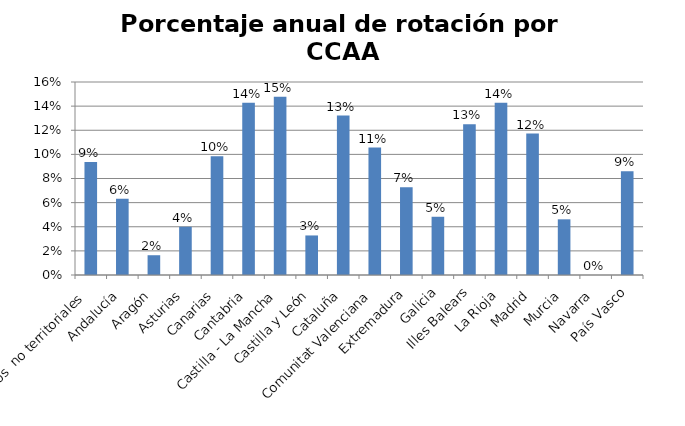
| Category | Porcentaje |
|---|---|
| Órganos  no territoriales | 0.094 |
| Andalucía | 0.063 |
| Aragón | 0.016 |
| Asturias | 0.04 |
| Canarias | 0.098 |
| Cantabria | 0.143 |
| Castilla - La Mancha | 0.148 |
| Castilla y León | 0.033 |
| Cataluña | 0.132 |
| Comunitat Valenciana | 0.106 |
| Extremadura | 0.073 |
| Galicia | 0.048 |
| Illes Balears | 0.125 |
| La Rioja | 0.143 |
| Madrid | 0.117 |
| Murcia | 0.046 |
| Navarra | 0 |
| País Vasco | 0.086 |